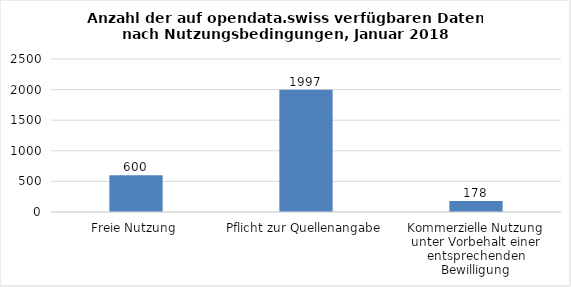
| Category | Series 0 |
|---|---|
| Freie Nutzung | 600 |
| Pflicht zur Quellenangabe | 1997 |
| Kommerzielle Nutzung unter Vorbehalt einer entsprechenden Bewilligung | 178 |